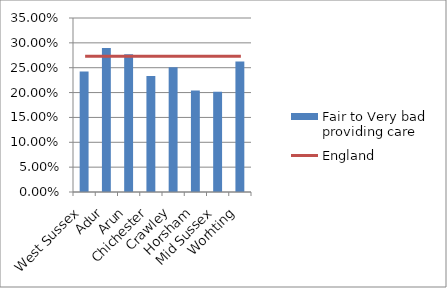
| Category | Fair to Very bad providing care |
|---|---|
| West Sussex | 0.242 |
| Adur | 0.29 |
| Arun | 0.277 |
| Chichester | 0.234 |
| Crawley | 0.251 |
| Horsham | 0.204 |
| Mid Sussex | 0.201 |
| Worhting | 0.262 |